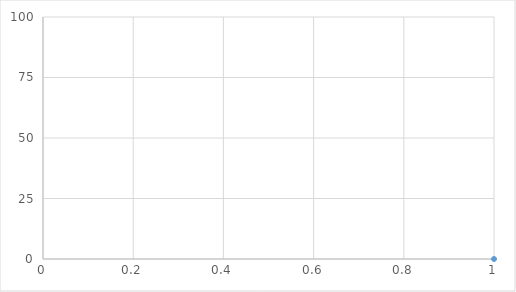
| Category | Series 0 |
|---|---|
| 0 | 0 |
| 1 | 6.283 |
| 2 | 10.813 |
| 3 | 45.637 |
| 4 | 59.861 |
| 5 | 69.821 |
| 6 | 77.432 |
| 7 | 78.36 |
| 8 | 85.597 |
| 9 | 96.13 |